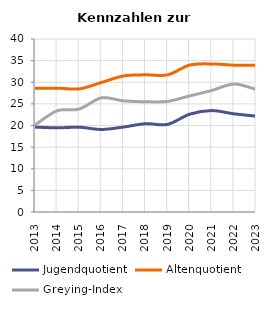
| Category | Jugendquotient | Altenquotient | Greying-Index |
|---|---|---|---|
| 2013.0 | 19.63 | 28.593 | 20.093 |
| 2014.0 | 19.457 | 28.634 | 23.404 |
| 2015.0 | 19.599 | 28.469 | 23.799 |
| 2016.0 | 19.082 | 29.934 | 26.389 |
| 2017.0 | 19.638 | 31.449 | 25.708 |
| 2018.0 | 20.411 | 31.718 | 25.49 |
| 2019.0 | 20.258 | 31.711 | 25.577 |
| 2020.0 | 22.62 | 33.97 | 26.84 |
| 2021.0 | 23.452 | 34.232 | 28.106 |
| 2022.0 | 22.7 | 33.95 | 29.58 |
| 2023.0 | 22.167 | 33.92 | 28.346 |